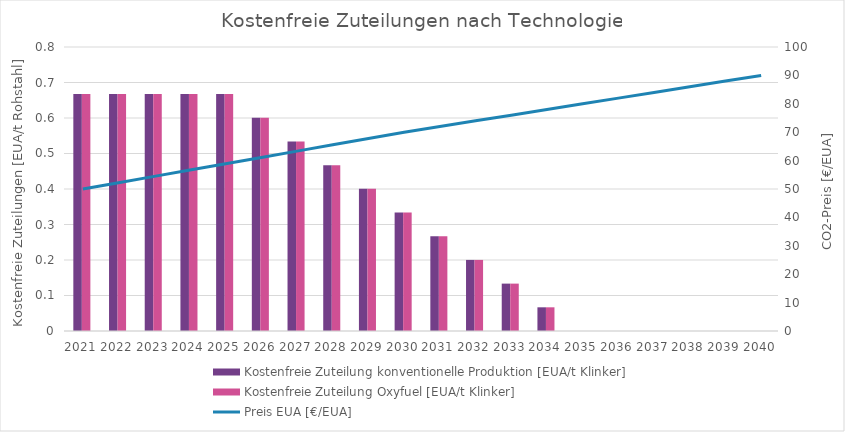
| Category | Kostenfreie Zuteilung konventionelle Produktion [EUA/t Klinker] | Kostenfreie Zuteilung Oxyfuel [EUA/t Klinker] |
|---|---|---|
| 0 | 0.667 | 0.667 |
| 1 | 0.667 | 0.667 |
| 2 | 0.667 | 0.667 |
| 3 | 0.667 | 0.667 |
| 4 | 0.667 | 0.667 |
| 5 | 0.601 | 0.601 |
| 6 | 0.534 | 0.534 |
| 7 | 0.467 | 0.467 |
| 8 | 0.4 | 0.4 |
| 9 | 0.334 | 0.334 |
| 10 | 0.267 | 0.267 |
| 11 | 0.2 | 0.2 |
| 12 | 0.133 | 0.133 |
| 13 | 0.067 | 0.067 |
| 14 | 0 | 0 |
| 15 | 0 | 0 |
| 16 | 0 | 0 |
| 17 | 0 | 0 |
| 18 | 0 | 0 |
| 19 | 0 | 0 |